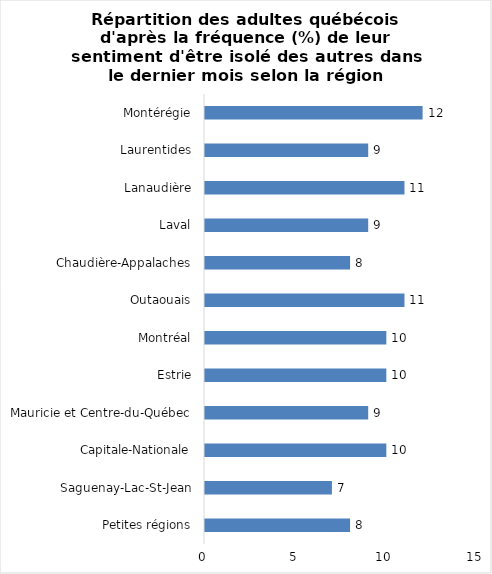
| Category | Series 0 |
|---|---|
| Petites régions | 8 |
| Saguenay-Lac-St-Jean | 7 |
| Capitale-Nationale | 10 |
| Mauricie et Centre-du-Québec | 9 |
| Estrie | 10 |
| Montréal | 10 |
| Outaouais | 11 |
| Chaudière-Appalaches | 8 |
| Laval | 9 |
| Lanaudière | 11 |
| Laurentides | 9 |
| Montérégie | 12 |